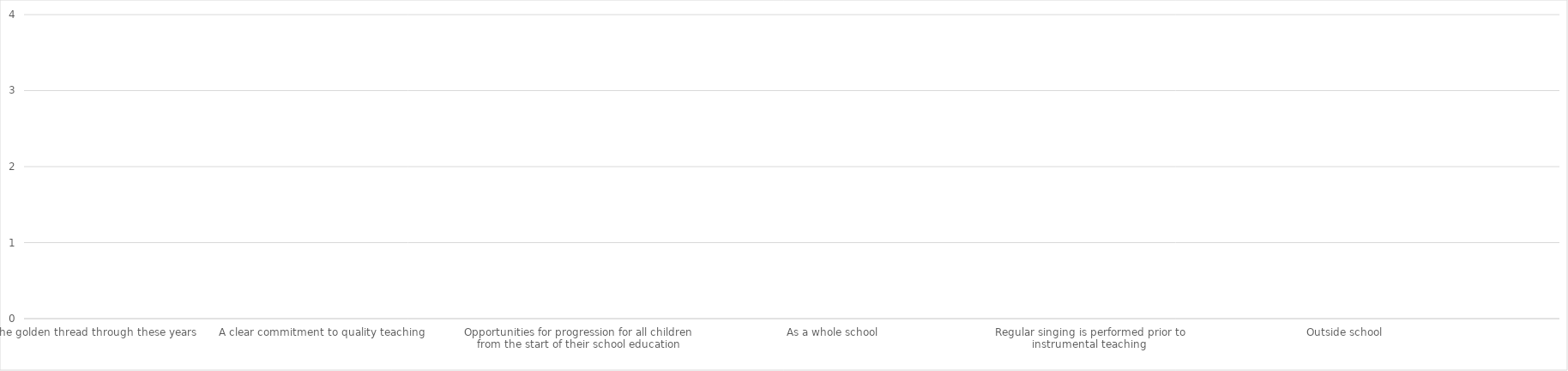
| Category | Series 0 |
|---|---|
| Singing is the golden thread through these years | 0 |
| Singing contribute to the wider life of the school | 0 |
| Sing with accurate pitch in unison or harmony with attention to phrase and dynamics | 0 |
| A clear commitment to quality teaching | 0 |
| Differentiate between learning to sing, and singing songs which are thematic, seasonal, cross-curricular | 0 |
| Clarity on what standards are achieved and how it's measured  | 0 |
| Opportunities for progression for all children from the start of their school education | 0 |
| Dedicated curriculum singing time | 0 |
| Incorporate short bursts of singing into every school day | 0 |
| As a whole school | 0 |
| In year groups | 0 |
| Assemblies are held offering an opportunity to performing singing as a class or ensemble | 0 |
| Regular singing is performed prior to instrumental teaching  | 0 |
| Regular singing continues during instrumental teaching and supports its success. | 0 |
| Within school | 0 |
| Outside school | 0 |
| Hear adults (including men) sing  | 0 |
| Using Hertfordshire Music Education Hub subsidised SingUp subscription to full extend. | 0 |